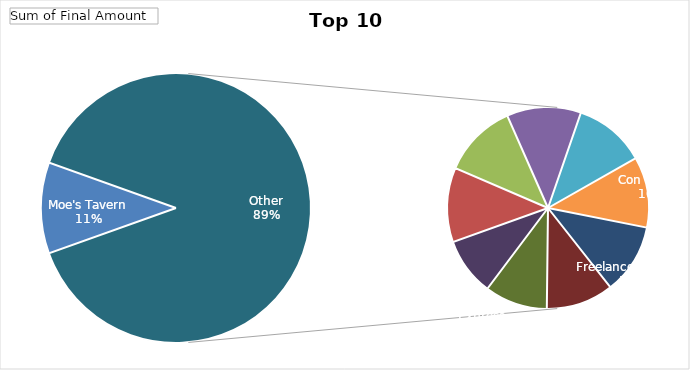
| Category | Total |
|---|---|
| Moe's Tavern | 19877.309 |
| City Bakery | 19348.176 |
| MTA | 19300.271 |
| Skillshare | 19288.295 |
| Trader Joe's | 18631.779 |
| Con Edison | 18379.189 |
| Freelancer's Union | 18260.515 |
| Fandango | 17499.479 |
| Express | 16310.564 |
| Amazon.com | 15053.057 |